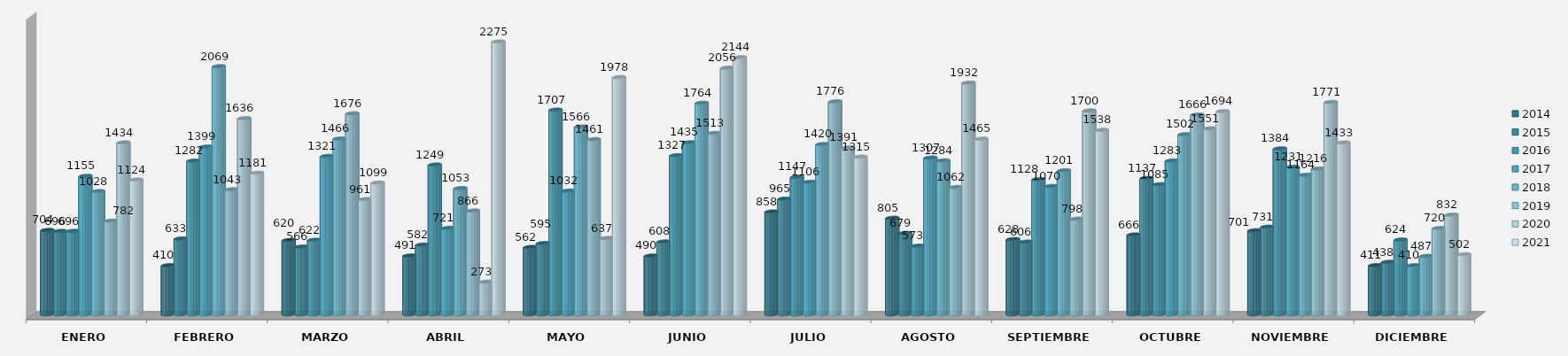
| Category | 2014 | 2015 | 2016 | 2017 | 2018 | 2019 | 2020 | 2021 |
|---|---|---|---|---|---|---|---|---|
| ENERO | 704 | 696 | 696 | 1155 | 1028 | 782 | 1434 | 1124 |
| FEBRERO | 410 | 633 | 1282 | 1399 | 2069 | 1043 | 1636 | 1181 |
| MARZO | 620 | 566 | 622 | 1321 | 1466 | 1676 | 961 | 1099 |
| ABRIL | 491 | 582 | 1249 | 721 | 1053 | 866 | 273 | 2275 |
| MAYO | 562 | 595 | 1707 | 1032 | 1566 | 1461 | 637 | 1978 |
| JUNIO | 490 | 608 | 1327 | 1435 | 1764 | 1513 | 2056 | 2144 |
| JULIO | 858 | 965 | 1147 | 1106 | 1420 | 1776 | 1391 | 1315 |
| AGOSTO | 805 | 679 | 573 | 1307 | 1284 | 1062 | 1932 | 1465 |
| SEPTIEMBRE | 628 | 606 | 1128 | 1070 | 1201 | 798 | 1700 | 1538 |
| OCTUBRE | 666 | 1137 | 1085 | 1283 | 1502 | 1666 | 1551 | 1694 |
| NOVIEMBRE | 701 | 731 | 1384 | 1231 | 1164 | 1216 | 1771 | 1433 |
| DICIEMBRE | 411 | 438 | 624 | 410 | 487 | 720 | 832 | 502 |